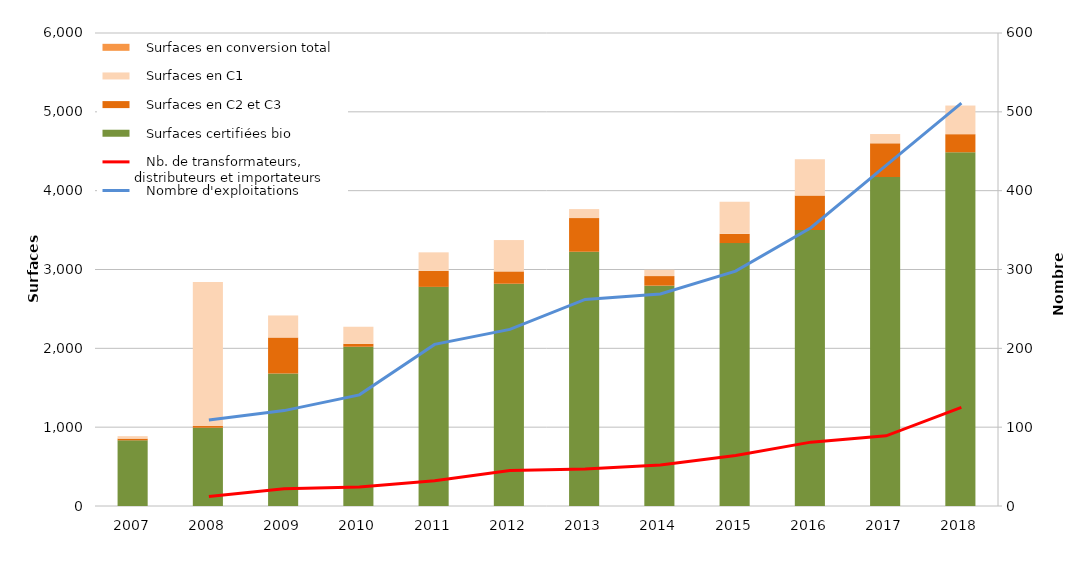
| Category |    Surfaces certifiées bio |    Surfaces en C2 et C3 |    Surfaces en C1 |    Surfaces en conversion total |
|---|---|---|---|---|
| 2007.0 | 832.994 | 21.87 | 31.217 |  |
| 2008.0 | 992.828 | 21.62 | 1826.587 |  |
| 2009.0 | 1681.65 | 455.898 | 279.392 |  |
| 2010.0 | 2020.156 | 37.701 | 215.919 |  |
| 2011.0 | 2779.6 | 203.11 | 234.988 |  |
| 2012.0 | 2819.444 | 156.41 | 397.756 |  |
| 2013.0 | 3225.244 | 426.516 | 114.685 |  |
| 2014.0 | 2794.741 | 121.99 | 80.363 |  |
| 2015.0 | 3335.525 | 116.904 | 406.904 |  |
| 2016.0 | 3502.075 | 436.924 | 460.169 |  |
| 2017.0 | 4173.631 | 426.66 | 118.144 |  |
| 2018.0 | 4487.115 | 229.395 | 363.32 |  |